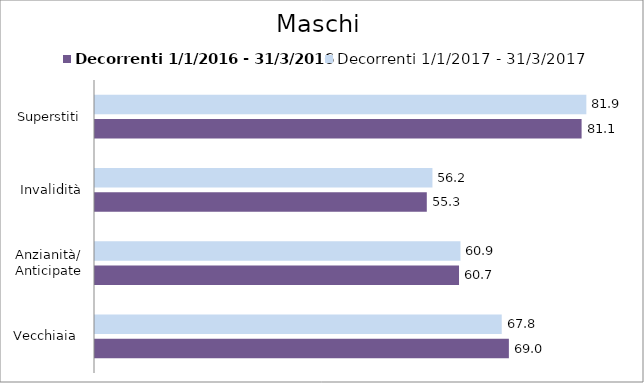
| Category | Decorrenti 1/1/2016 - 31/3/2016 | Decorrenti 1/1/2017 - 31/3/2017 |
|---|---|---|
| Vecchiaia  | 68.98 | 67.79 |
| Anzianità/ Anticipate | 60.67 | 60.91 |
| Invalidità | 55.3 | 56.24 |
| Superstiti | 81.1 | 81.89 |